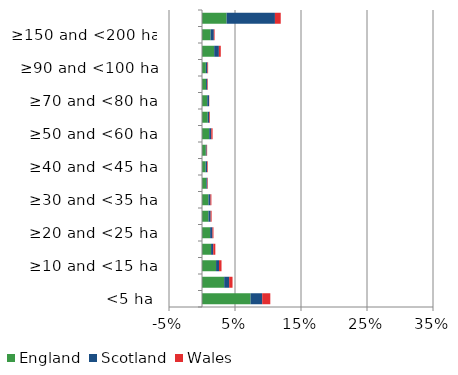
| Category | England | Scotland | Wales |
|---|---|---|---|
| <5 ha | 0.074 | 0.018 | 0.012 |
| ≥5 and <10 ha | 0.034 | 0.007 | 0.005 |
| ≥10 and <15 ha | 0.021 | 0.004 | 0.004 |
| ≥15 and <20 ha | 0.014 | 0.003 | 0.003 |
| ≥20 and <25 ha | 0.012 | 0.004 | 0.002 |
| ≥25 and <30 ha | 0.01 | 0.003 | 0.001 |
| ≥30 and <35 ha | 0.01 | 0.003 | 0.001 |
| ≥35 and <40 ha | 0.007 | 0.002 | 0.001 |
| ≥40 and <45 ha | 0.006 | 0.002 | 0.001 |
| ≥45 and <50 ha | 0.006 | 0.001 | 0.001 |
| ≥50 and <60 ha | 0.011 | 0.003 | 0.002 |
| ≥60 and <70 ha | 0.009 | 0.002 | 0.001 |
| ≥70 and <80 ha | 0.008 | 0.003 | 0 |
| ≥80 and <90 ha | 0.006 | 0.002 | 0.001 |
| ≥90 and <100 ha | 0.006 | 0.002 | 0.001 |
| ≥100 and <150 ha | 0.018 | 0.007 | 0.003 |
| ≥150 and <200 ha | 0.013 | 0.005 | 0.001 |
| ≥200 ha | 0.037 | 0.073 | 0.009 |